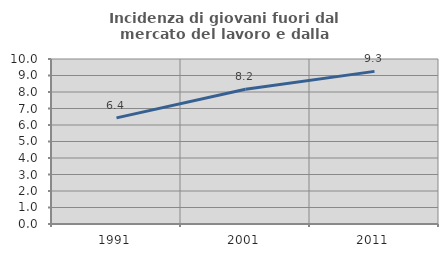
| Category | Incidenza di giovani fuori dal mercato del lavoro e dalla formazione  |
|---|---|
| 1991.0 | 6.431 |
| 2001.0 | 8.166 |
| 2011.0 | 9.25 |